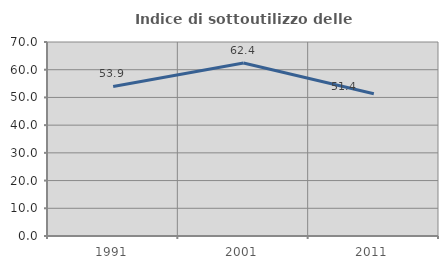
| Category | Indice di sottoutilizzo delle abitazioni  |
|---|---|
| 1991.0 | 53.947 |
| 2001.0 | 62.416 |
| 2011.0 | 51.351 |